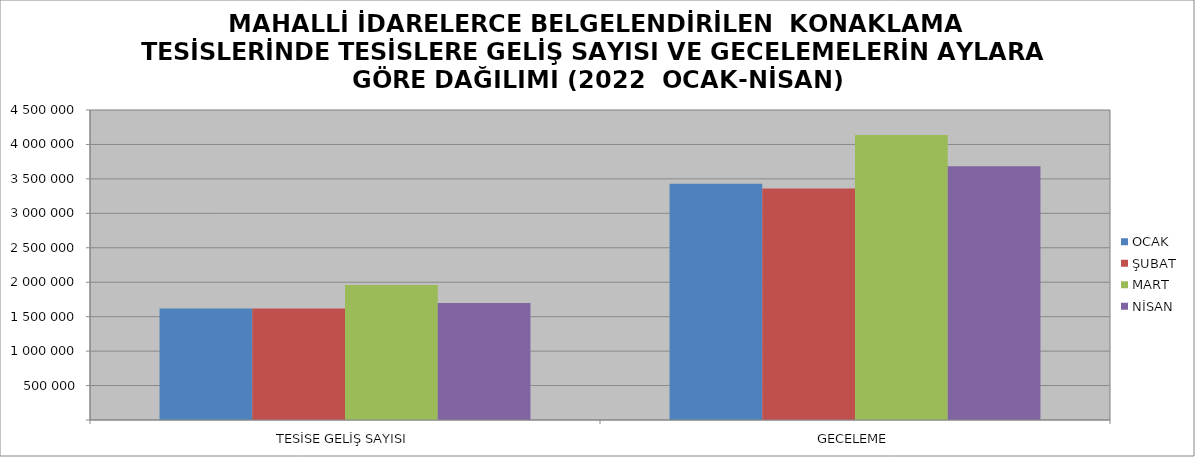
| Category | OCAK | ŞUBAT | MART | NİSAN |
|---|---|---|---|---|
| TESİSE GELİŞ SAYISI | 1617436 | 1619305 | 1960867 | 1699422 |
| GECELEME | 3427709 | 3362025 | 4136510 | 3684991 |